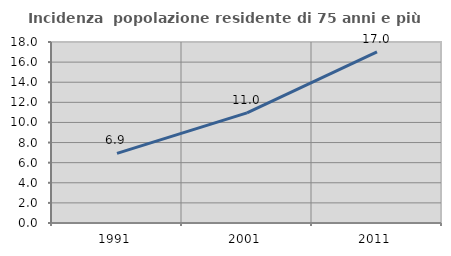
| Category | Incidenza  popolazione residente di 75 anni e più |
|---|---|
| 1991.0 | 6.92 |
| 2001.0 | 10.951 |
| 2011.0 | 17.024 |